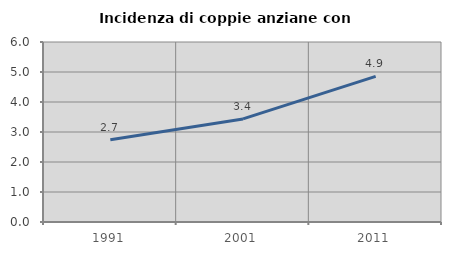
| Category | Incidenza di coppie anziane con figli |
|---|---|
| 1991.0 | 2.742 |
| 2001.0 | 3.435 |
| 2011.0 | 4.854 |